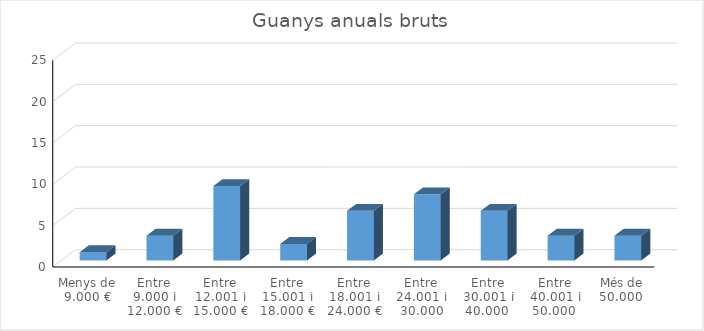
| Category | Series 0 |
|---|---|
| Menys de 9.000 € | 1 |
| Entre 9.000 i 12.000 € | 3 |
| Entre 12.001 i 15.000 € | 9 |
| Entre 15.001 i 18.000 € | 2 |
| Entre 18.001 i 24.000 € | 6 |
| Entre 24.001 i 30.000 | 8 |
| Entre 30.001 i 40.000  | 6 |
| Entre 40.001 i 50.000  | 3 |
| Més de 50.000  | 3 |